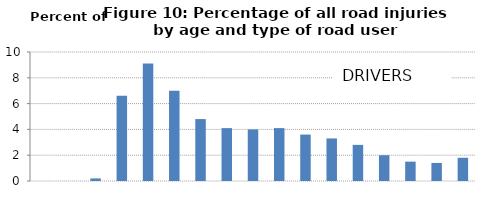
| Category | DRIVERS |
|---|---|
| 0-4  | 0 |
| 5-9 | 0 |
| 10-14 | 0.2 |
| 15-19  | 6.6 |
| 20-24  | 9.1 |
| 25-29  | 7 |
| 30-34  | 4.8 |
| 35-39  | 4.1 |
| 40-44  | 4 |
| 45-49  | 4.1 |
| 50-54  | 3.6 |
| 55-59  | 3.3 |
| 60-64  | 2.8 |
| 65-69  | 2 |
| 70-74  | 1.5 |
| 75-79  | 1.4 |
| 80+ | 1.8 |